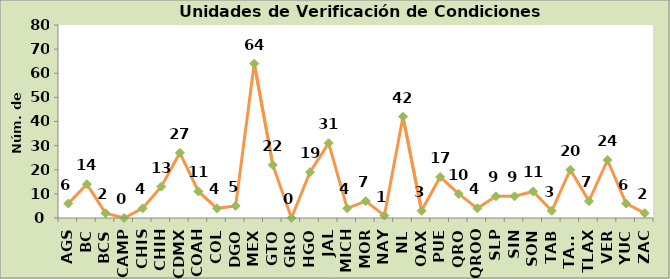
| Category | Series 0 |
|---|---|
| AGS | 6 |
| BC | 14 |
| BCS | 2 |
| CAMP | 0 |
| CHIS | 4 |
| CHIH | 13 |
| CDMX | 27 |
| COAH | 11 |
| COL | 4 |
| DGO | 5 |
| MEX | 64 |
| GTO | 22 |
| GRO | 0 |
| HGO | 19 |
| JAL | 31 |
| MICH | 4 |
| MOR | 7 |
| NAY | 1 |
| NL | 42 |
| OAX | 3 |
| PUE | 17 |
| QRO | 10 |
| QROO | 4 |
| SLP | 9 |
| SIN | 9 |
| SON | 11 |
| TAB | 3 |
| TAMS | 20 |
| TLAX | 7 |
| VER | 24 |
| YUC | 6 |
| ZAC | 2 |